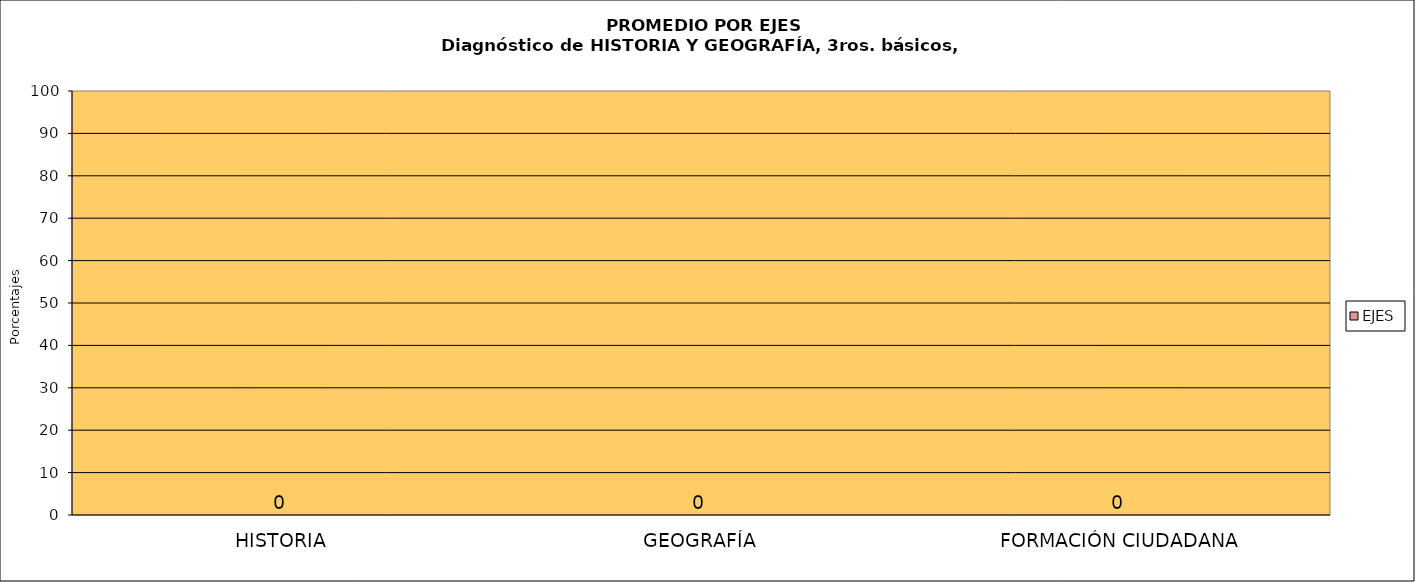
| Category | EJES |
|---|---|
| HISTORIA | 0 |
| GEOGRAFÍA | 0 |
| FORMACIÓN CIUDADANA | 0 |